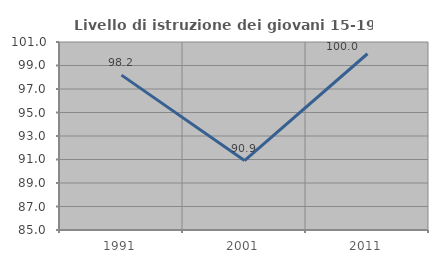
| Category | Livello di istruzione dei giovani 15-19 anni |
|---|---|
| 1991.0 | 98.182 |
| 2001.0 | 90.909 |
| 2011.0 | 100 |